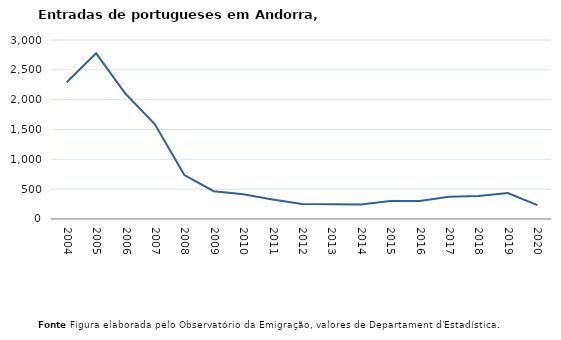
| Category | Entradas |
|---|---|
| 2004.0 | 2292 |
| 2005.0 | 2776 |
| 2006.0 | 2099 |
| 2007.0 | 1587 |
| 2008.0 | 736 |
| 2009.0 | 466 |
| 2010.0 | 415 |
| 2011.0 | 327 |
| 2012.0 | 250 |
| 2013.0 | 246 |
| 2014.0 | 244 |
| 2015.0 | 303 |
| 2016.0 | 301 |
| 2017.0 | 372 |
| 2018.0 | 386 |
| 2019.0 | 434 |
| 2020.0 | 232 |